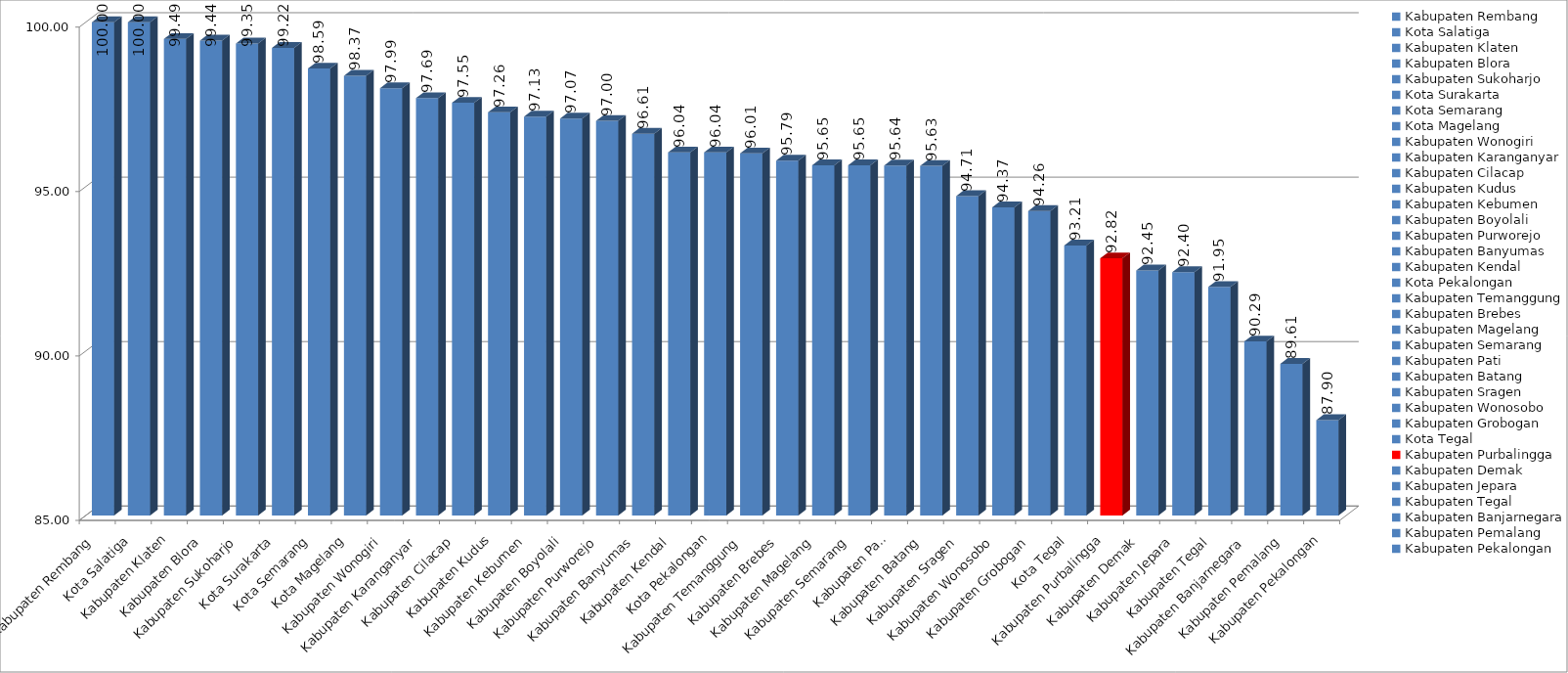
| Category | Series 0 |
|---|---|
| Kabupaten Rembang | 100 |
| Kota Salatiga | 100 |
| Kabupaten Klaten | 99.49 |
| Kabupaten Blora | 99.44 |
| Kabupaten Sukoharjo | 99.35 |
| Kota Surakarta | 99.22 |
| Kota Semarang | 98.59 |
| Kota Magelang | 98.37 |
| Kabupaten Wonogiri | 97.99 |
| Kabupaten Karanganyar | 97.69 |
| Kabupaten Cilacap | 97.55 |
| Kabupaten Kudus | 97.26 |
| Kabupaten Kebumen | 97.13 |
| Kabupaten Boyolali | 97.07 |
| Kabupaten Purworejo | 97 |
| Kabupaten Banyumas | 96.61 |
| Kabupaten Kendal | 96.04 |
| Kota Pekalongan | 96.04 |
| Kabupaten Temanggung | 96.01 |
| Kabupaten Brebes | 95.79 |
| Kabupaten Magelang | 95.65 |
| Kabupaten Semarang | 95.65 |
| Kabupaten Pati | 95.64 |
| Kabupaten Batang | 95.63 |
| Kabupaten Sragen | 94.71 |
| Kabupaten Wonosobo | 94.37 |
| Kabupaten Grobogan | 94.26 |
| Kota Tegal | 93.21 |
| Kabupaten Purbalingga | 92.82 |
| Kabupaten Demak | 92.45 |
| Kabupaten Jepara | 92.4 |
| Kabupaten Tegal | 91.95 |
| Kabupaten Banjarnegara | 90.29 |
| Kabupaten Pemalang | 89.61 |
| Kabupaten Pekalongan | 87.9 |